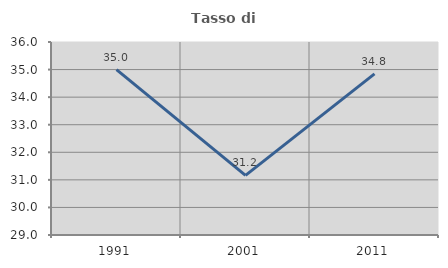
| Category | Tasso di occupazione   |
|---|---|
| 1991.0 | 35.001 |
| 2001.0 | 31.163 |
| 2011.0 | 34.846 |